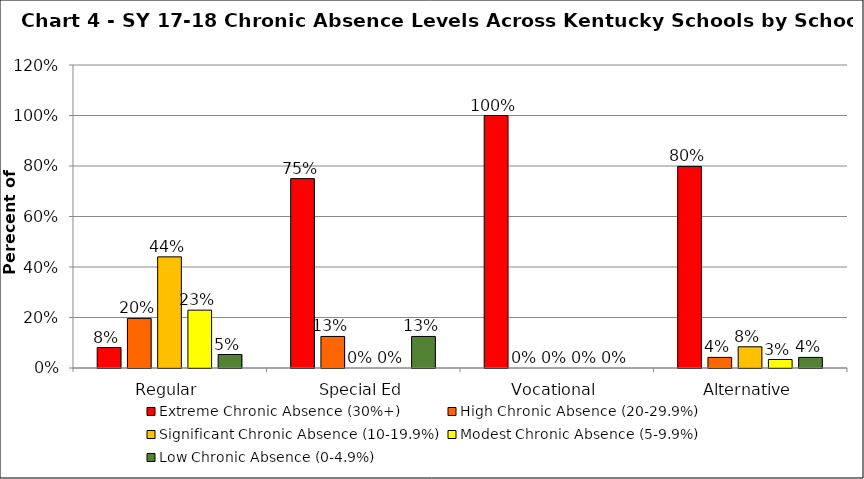
| Category | Extreme Chronic Absence (30%+) | High Chronic Absence (20-29.9%) | Significant Chronic Absence (10-19.9%) | Modest Chronic Absence (5-9.9%) | Low Chronic Absence (0-4.9%) |
|---|---|---|---|---|---|
| 0 | 0.081 | 0.196 | 0.44 | 0.229 | 0.053 |
| 1 | 0.75 | 0.125 | 0 | 0 | 0.125 |
| 2 | 1 | 0 | 0 | 0 | 0 |
| 3 | 0.798 | 0.042 | 0.084 | 0.034 | 0.042 |